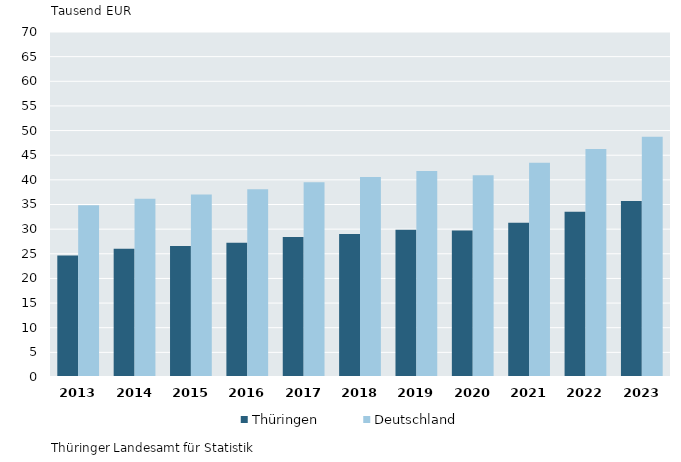
| Category | Thüringen | Deutschland |
|---|---|---|
| 2013.0 | 24.66 | 34.86 |
| 2014.0 | 26.03 | 36.15 |
| 2015.0 | 26.56 | 37.05 |
| 2016.0 | 27.26 | 38.07 |
| 2017.0 | 28.39 | 39.53 |
| 2018.0 | 28.99 | 40.59 |
| 2019.0 | 29.86 | 41.81 |
| 2020.0 | 29.75 | 40.93 |
| 2021.0 | 31.29 | 43.48 |
| 2022.0 | 33.55 | 46.26 |
| 2023.0 | 35.72 | 48.75 |